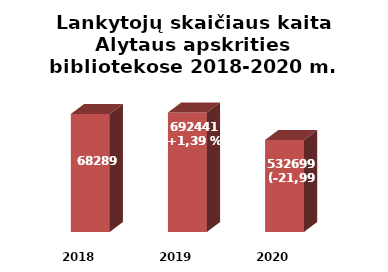
| Category | Series 0 |
|---|---|
| 2018.0 | 682898 |
| 2019.0 | 692441 |
| 2020.0 | 532699 |